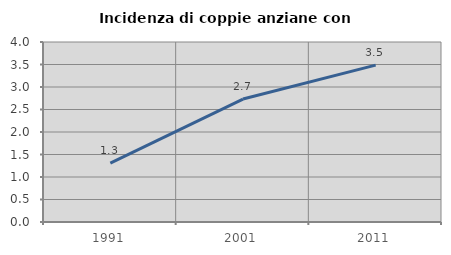
| Category | Incidenza di coppie anziane con figli |
|---|---|
| 1991.0 | 1.307 |
| 2001.0 | 2.732 |
| 2011.0 | 3.485 |